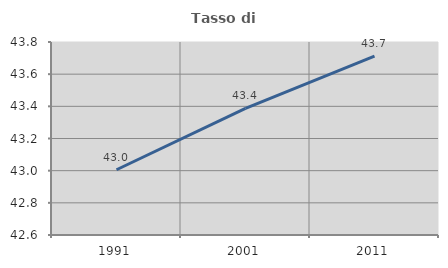
| Category | Tasso di occupazione   |
|---|---|
| 1991.0 | 43.006 |
| 2001.0 | 43.388 |
| 2011.0 | 43.712 |